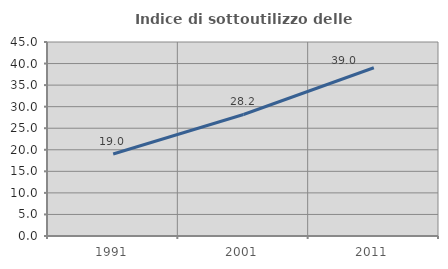
| Category | Indice di sottoutilizzo delle abitazioni  |
|---|---|
| 1991.0 | 19.008 |
| 2001.0 | 28.188 |
| 2011.0 | 39.03 |